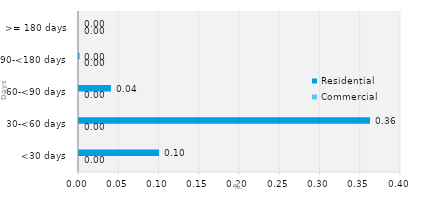
| Category | Commercial | Residential |
|---|---|---|
| <30 days | 0 | 0.1 |
| 30-<60 days | 0 | 0.362 |
| 60-<90 days | 0 | 0.04 |
| 90-<180 days | 0 | 0.001 |
| >= 180 days | 0 | 0 |